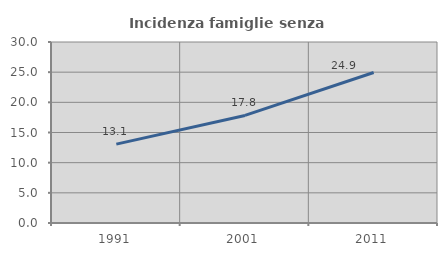
| Category | Incidenza famiglie senza nuclei |
|---|---|
| 1991.0 | 13.069 |
| 2001.0 | 17.829 |
| 2011.0 | 24.938 |